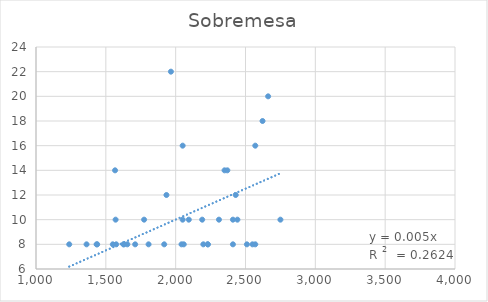
| Category | Sobremesa |
|---|---|
| 1550.0 | 8 |
| 2310.0 | 10 |
| 1570.0 | 10 |
| 2042.0 | 8 |
| 1934.0 | 12 |
| 1630.0 | 8 |
| 1574.0 | 8 |
| 1566.0 | 14 |
| 2050.0 | 16 |
| 2350.0 | 14 |
| 1918.0 | 8 |
| 1438.0 | 8 |
| 1654.0 | 8 |
| 2058.0 | 8 |
| 2442.0 | 10 |
| 2050.0 | 10 |
| 1966.0 | 22 |
| 2550.0 | 8 |
| 2198.0 | 8 |
| 1626.0 | 8 |
| 2510.0 | 8 |
| 2410.0 | 10 |
| 2622.0 | 18 |
| 1362.0 | 8 |
| 2750.0 | 10 |
| 1806.0 | 8 |
| 2190.0 | 10 |
| 2430.0 | 12 |
| 2094.0 | 10 |
| 2570.0 | 16 |
| 2410.0 | 8 |
| 1774.0 | 10 |
| 1710.0 | 8 |
| 2370.0 | 14 |
| 2230.0 | 8 |
| 2570.0 | 8 |
| 2662.0 | 20 |
| 1238.0 | 8 |
| 2230.0 | 8 |
| 1434.0 | 8 |